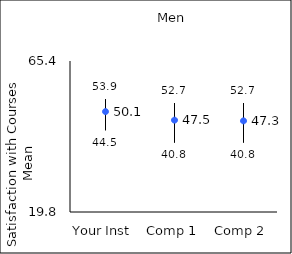
| Category | 25th percentile | 75th percentile | Mean |
|---|---|---|---|
| Your Inst | 44.5 | 53.9 | 50.12 |
| Comp 1 | 40.8 | 52.7 | 47.54 |
| Comp 2 | 40.8 | 52.7 | 47.32 |